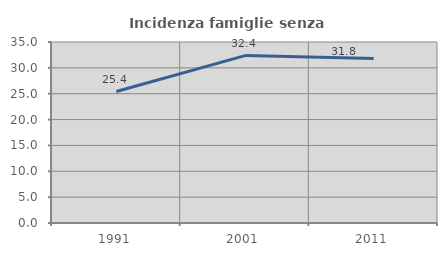
| Category | Incidenza famiglie senza nuclei |
|---|---|
| 1991.0 | 25.417 |
| 2001.0 | 32.374 |
| 2011.0 | 31.818 |